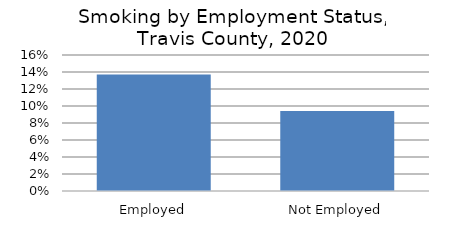
| Category | Series 0 |
|---|---|
| Employed | 0.137 |
| Not Employed | 0.094 |